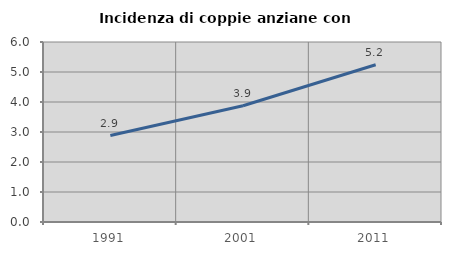
| Category | Incidenza di coppie anziane con figli |
|---|---|
| 1991.0 | 2.883 |
| 2001.0 | 3.876 |
| 2011.0 | 5.24 |